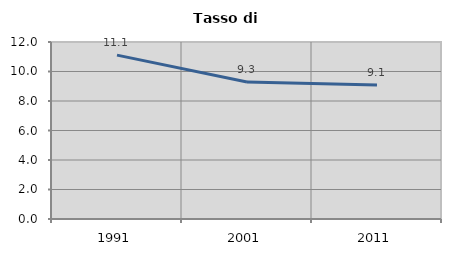
| Category | Tasso di disoccupazione   |
|---|---|
| 1991.0 | 11.111 |
| 2001.0 | 9.286 |
| 2011.0 | 9.091 |